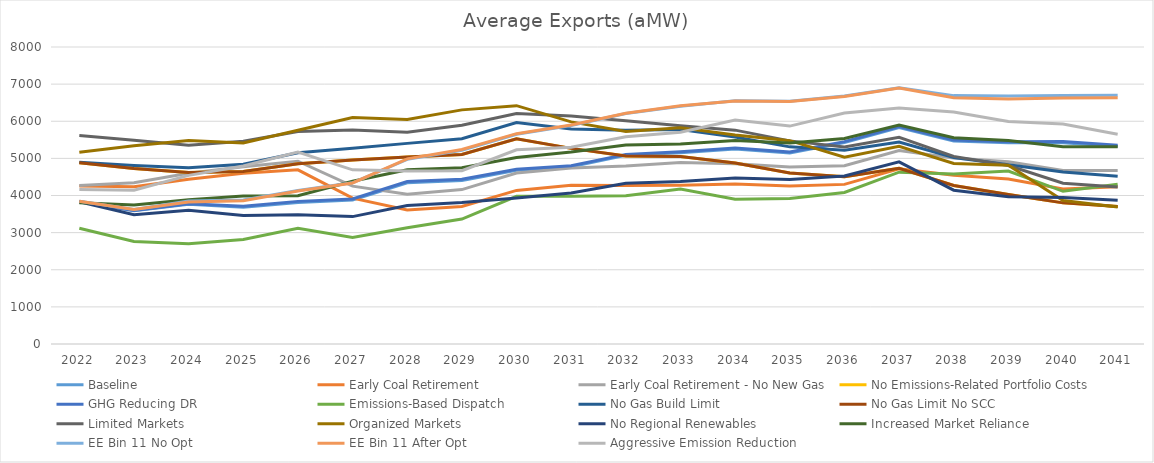
| Category | Baseline  | Early Coal Retirement | Early Coal Retirement - No New Gas | No Emissions-Related Portfolio Costs | GHG Reducing DR | Emissions-Based Dispatch | No Gas Build Limit | No Gas Limit No SCC | Limited Markets | Organized Markets | No Regional Renewables | Increased Market Reliance | EE Bin 11 No Opt | EE Bin 11 After Opt | Aggressive Emission Reduction |
|---|---|---|---|---|---|---|---|---|---|---|---|---|---|---|---|
| 2022.0 | 3832.412 | 4256.69 | 4271.469 | 4881.278 | 3835.64 | 3119.054 | 4895.002 | 4881.278 | 5614.491 | 5167.959 | 3832.412 | 3803.965 | 3843.627 | 3843.627 | 4163.731 |
| 2023.0 | 3586.47 | 4236.593 | 4344.024 | 4728.001 | 3595.065 | 2760.618 | 4810.018 | 4728.001 | 5486.199 | 5341.168 | 3481.604 | 3743.442 | 3626.139 | 3622.309 | 4144.094 |
| 2024.0 | 3761.49 | 4437.83 | 4599.304 | 4619.985 | 3776.603 | 2701.228 | 4744.797 | 4619.985 | 5356.645 | 5479.698 | 3605.691 | 3886.913 | 3851.031 | 3824.327 | 4542.304 |
| 2025.0 | 3685.977 | 4597.36 | 4774.497 | 4644.522 | 3707.314 | 2813.565 | 4844.54 | 4644.522 | 5461.463 | 5413.022 | 3462.752 | 3988.24 | 3880.283 | 3861.848 | 4795.087 |
| 2026.0 | 3814.137 | 4692.381 | 4924.603 | 4857.42 | 3841.822 | 3113.947 | 5149.833 | 4857.42 | 5724.705 | 5756.682 | 3480.735 | 3994.398 | 4135.899 | 4123.433 | 5167.205 |
| 2027.0 | 3876.007 | 3929.334 | 4251.762 | 4956.28 | 3906.393 | 2872.529 | 5275.085 | 4956.28 | 5764.431 | 6102.647 | 3431.219 | 4384.635 | 4341.542 | 4338.222 | 4690.276 |
| 2028.0 | 4344.486 | 3609.174 | 4035.78 | 5039.57 | 4375.416 | 3129.71 | 5404.116 | 5039.57 | 5703.635 | 6046.218 | 3731.626 | 4695.987 | 4973.111 | 4986.443 | 4661.468 |
| 2029.0 | 4405.371 | 3703.635 | 4159.037 | 5104.505 | 4435.737 | 3366.544 | 5527.378 | 5104.505 | 5891.356 | 6306.484 | 3808.633 | 4744.87 | 5218.894 | 5237.457 | 4666.595 |
| 2030.0 | 4679.43 | 4136.979 | 4605.888 | 5526.98 | 4707.242 | 3976.549 | 5967.086 | 5526.98 | 6210.498 | 6419.781 | 3934.328 | 5021.605 | 5647.972 | 5665.142 | 5231.368 |
| 2031.0 | 4777.201 | 4275.983 | 4743.076 | 5269.653 | 4803.918 | 3980.311 | 5793.842 | 5269.653 | 6139.127 | 5982.838 | 4067.229 | 5169.813 | 5885.543 | 5897.997 | 5299.166 |
| 2032.0 | 5082.463 | 4268.129 | 4792.667 | 5065.499 | 5107.16 | 3992.69 | 5754.459 | 5065.499 | 6010.302 | 5727.142 | 4327.556 | 5358.113 | 6208.663 | 6217.88 | 5584.569 |
| 2033.0 | 5153.176 | 4277.692 | 4888.669 | 5051.565 | 5180.22 | 4172.948 | 5775.299 | 5051.565 | 5876.255 | 5827.673 | 4374.923 | 5388.901 | 6406.999 | 6415.532 | 5703.037 |
| 2034.0 | 5253.185 | 4312.006 | 4852.277 | 4874.549 | 5282.579 | 3896.934 | 5573.016 | 4874.549 | 5760.507 | 5629.332 | 4468.341 | 5481.818 | 6552.942 | 6543.145 | 6032.103 |
| 2035.0 | 5145.548 | 4254.986 | 4765.269 | 4606.566 | 5174.466 | 3918.232 | 5309.911 | 4606.566 | 5471.404 | 5476.966 | 4429.15 | 5411.093 | 6541.907 | 6530.119 | 5869.585 |
| 2036.0 | 5424.034 | 4299.598 | 4803.307 | 4504.509 | 5451.194 | 4081.725 | 5220.619 | 4504.509 | 5308.505 | 5029.309 | 4523.232 | 5537.052 | 6677.795 | 6669.009 | 6220.31 |
| 2037.0 | 5833.48 | 4721.412 | 5209.097 | 4732.442 | 5857.51 | 4628.416 | 5440.882 | 4732.442 | 5567.837 | 5324.289 | 4906.279 | 5900.532 | 6900.293 | 6893.006 | 6354.39 |
| 2038.0 | 5467.667 | 4547.131 | 5007.581 | 4269.831 | 5496.814 | 4578.719 | 5025.827 | 4269.831 | 5053.49 | 4860.882 | 4142.916 | 5555.015 | 6690.632 | 6631.851 | 6250.591 |
| 2039.0 | 5417.546 | 4446.531 | 4908.951 | 4026.15 | 5448.612 | 4658.792 | 4828.519 | 4026.15 | 4808.897 | 4812.827 | 3967.573 | 5483.276 | 6678.765 | 6601.123 | 5994.376 |
| 2040.0 | 5422.503 | 4176.09 | 4672.968 | 3801.485 | 5454.394 | 4112.172 | 4633.127 | 3801.485 | 4329.779 | 3863.954 | 3943.075 | 5312.741 | 6694.194 | 6625.48 | 5923.074 |
| 2041.0 | 5321.605 | 4234.798 | 4675.874 | 3701.254 | 5355.171 | 4303.925 | 4521.26 | 3701.254 | 4232.23 | 3693.183 | 3870.348 | 5309.989 | 6699.826 | 6634.852 | 5652.442 |